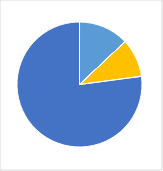
| Category | Series 0 |
|---|---|
| 0 | 0.123 |
| 1 | 0 |
| 2 | 0 |
| 3 | 0.094 |
| 4 | 0.732 |